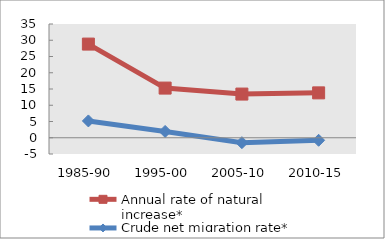
| Category | Annual rate of natural increase* | Crude net migration rate* |
|---|---|---|
| 1985-90 | 28.82 | 5.176 |
| 1995-00 | 15.279 | 1.947 |
| 2005-10 | 13.441 | -1.519 |
| 2010-15 | 13.808 | -0.78 |